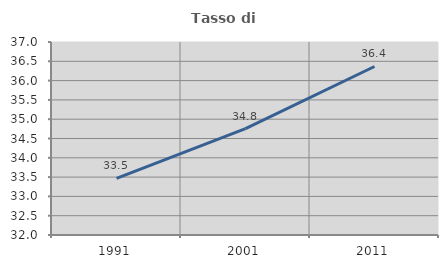
| Category | Tasso di occupazione   |
|---|---|
| 1991.0 | 33.467 |
| 2001.0 | 34.758 |
| 2011.0 | 36.365 |